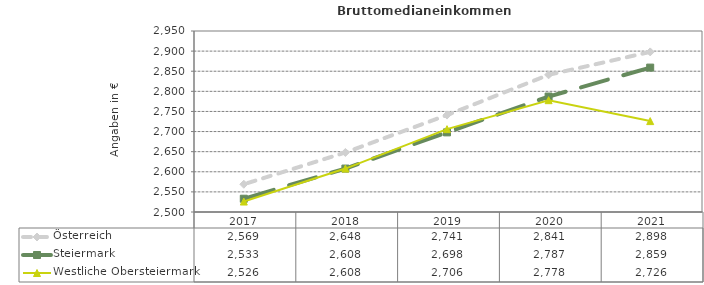
| Category | Österreich | Steiermark | Westliche Obersteiermark |
|---|---|---|---|
| 2021.0 | 2898 | 2859 | 2726 |
| 2020.0 | 2841 | 2787 | 2778 |
| 2019.0 | 2741 | 2698 | 2706 |
| 2018.0 | 2648 | 2608 | 2608 |
| 2017.0 | 2569 | 2533 | 2526 |